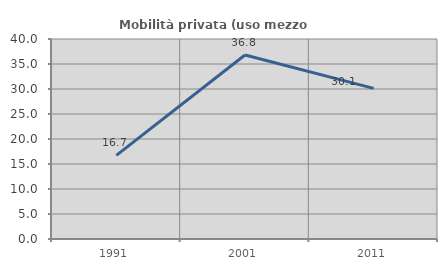
| Category | Mobilità privata (uso mezzo privato) |
|---|---|
| 1991.0 | 16.73 |
| 2001.0 | 36.792 |
| 2011.0 | 30.12 |